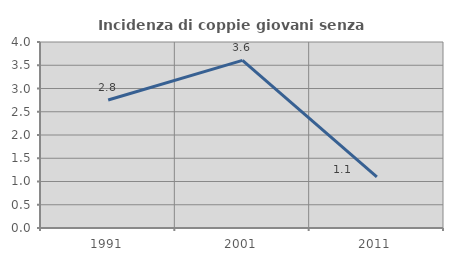
| Category | Incidenza di coppie giovani senza figli |
|---|---|
| 1991.0 | 2.752 |
| 2001.0 | 3.604 |
| 2011.0 | 1.099 |